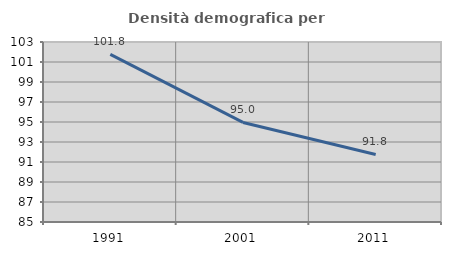
| Category | Densità demografica |
|---|---|
| 1991.0 | 101.77 |
| 2001.0 | 94.958 |
| 2011.0 | 91.758 |